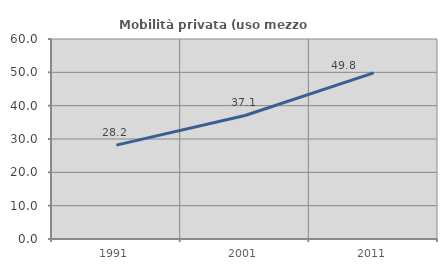
| Category | Mobilità privata (uso mezzo privato) |
|---|---|
| 1991.0 | 28.159 |
| 2001.0 | 37.056 |
| 2011.0 | 49.845 |